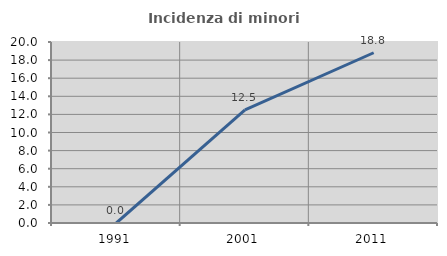
| Category | Incidenza di minori stranieri |
|---|---|
| 1991.0 | 0 |
| 2001.0 | 12.5 |
| 2011.0 | 18.812 |